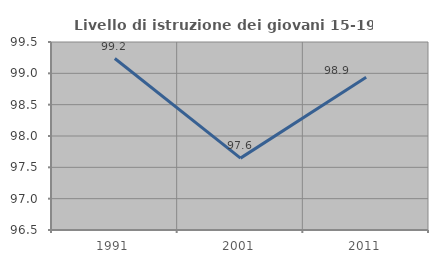
| Category | Livello di istruzione dei giovani 15-19 anni |
|---|---|
| 1991.0 | 99.237 |
| 2001.0 | 97.647 |
| 2011.0 | 98.936 |